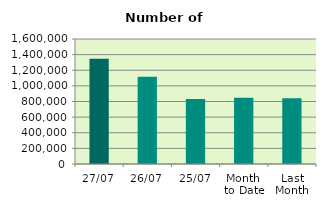
| Category | Series 0 |
|---|---|
| 27/07 | 1348008 |
| 26/07 | 1117200 |
| 25/07 | 833088 |
| Month 
to Date | 846804.632 |
| Last
Month | 840506.364 |